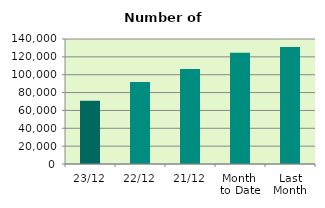
| Category | Series 0 |
|---|---|
| 23/12 | 70926 |
| 22/12 | 91782 |
| 21/12 | 106284 |
| Month 
to Date | 124471.529 |
| Last
Month | 131016.636 |